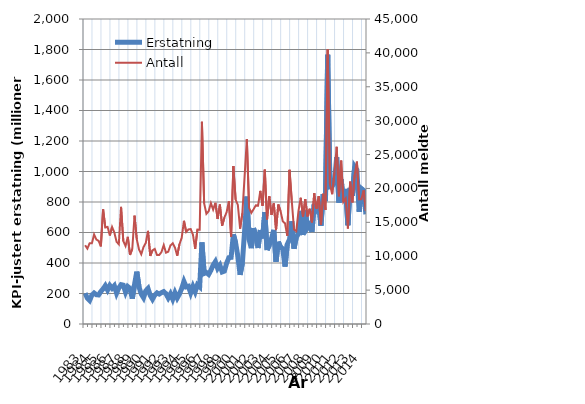
| Category | Erstatning |
|---|---|
| 1983.0 | 201.799 |
| nan | 169.038 |
| nan | 154.585 |
| nan | 189.36 |
| 1984.0 | 203.057 |
| nan | 192.077 |
| nan | 190.441 |
| nan | 213.009 |
| 1985.0 | 230.184 |
| nan | 251.598 |
| nan | 222.945 |
| nan | 252.85 |
| 1986.0 | 234.431 |
| nan | 250.851 |
| nan | 201.901 |
| nan | 236.27 |
| 1987.0 | 258.121 |
| nan | 254.718 |
| nan | 208.446 |
| nan | 245.243 |
| 1988.0 | 233.422 |
| nan | 166.394 |
| nan | 259.163 |
| nan | 343.318 |
| 1989.0 | 242.547 |
| nan | 196.036 |
| nan | 172.495 |
| nan | 217.622 |
| 1990.0 | 233.016 |
| nan | 187.462 |
| nan | 162.579 |
| nan | 189.236 |
| 1991.0 | 204.204 |
| nan | 196.341 |
| nan | 205.484 |
| nan | 212.445 |
| 1992.0 | 198.463 |
| nan | 171.007 |
| nan | 197.593 |
| nan | 163.054 |
| 1993.0 | 204.588 |
| nan | 170.263 |
| nan | 196.708 |
| nan | 232.712 |
| 1994.0 | 278.723 |
| nan | 243.667 |
| nan | 247.563 |
| nan | 204.054 |
| 1995.0 | 245.842 |
| nan | 211.497 |
| nan | 256.991 |
| nan | 244 |
| 1996.0 | 535.09 |
| nan | 331.337 |
| nan | 337.257 |
| nan | 325.257 |
| 1997.0 | 352.12 |
| nan | 386.392 |
| nan | 409.193 |
| nan | 365.095 |
| 1998.0 | 385.166 |
| nan | 341.221 |
| nan | 346.795 |
| nan | 398.602 |
| 1999.0 | 434.76 |
| nan | 436.872 |
| nan | 587.867 |
| nan | 532.391 |
| 2000.0 | 443.784 |
| nan | 322.284 |
| nan | 399.541 |
| nan | 609.178 |
| 2001.0 | 836.026 |
| nan | 553.453 |
| nan | 497.074 |
| nan | 628.9 |
| 2002.0 | 572.775 |
| nan | 498.37 |
| nan | 615.9 |
| nan | 561.222 |
| 2003.0 | 734.001 |
| nan | 485.295 |
| nan | 516.292 |
| nan | 562.424 |
| 2004.0 | 617.01 |
| nan | 407.925 |
| nan | 539.294 |
| nan | 504.074 |
| 2005.0 | 493.365 |
| nan | 376.506 |
| nan | 522.692 |
| nan | 553.922 |
| 2006.0 | 673.302 |
| nan | 493.774 |
| nan | 568.148 |
| nan | 592.735 |
| 2007.0 | 741.926 |
| nan | 583.311 |
| nan | 745.277 |
| nan | 630.118 |
| 2008.0 | 651.624 |
| nan | 603.24 |
| nan | 787.866 |
| nan | 756.664 |
| 2009.0 | 794.035 |
| nan | 644.63 |
| nan | 851.539 |
| nan | 804.882 |
| 2010.0 | 1765.585 |
| nan | 900.536 |
| nan | 904.868 |
| nan | 925.719 |
| 2011.0 | 1094.03 |
| nan | 795.553 |
| nan | 948.575 |
| nan | 799.425 |
| 2012.0 | 885.653 |
| nan | 647.494 |
| nan | 892.713 |
| nan | 840.573 |
| 2013.0 | 1032.312 |
| nan | 1010.828 |
| nan | 735.525 |
| nan | 888.429 |
| 2014.0 | 876.23 |
| nan | 719.557 |